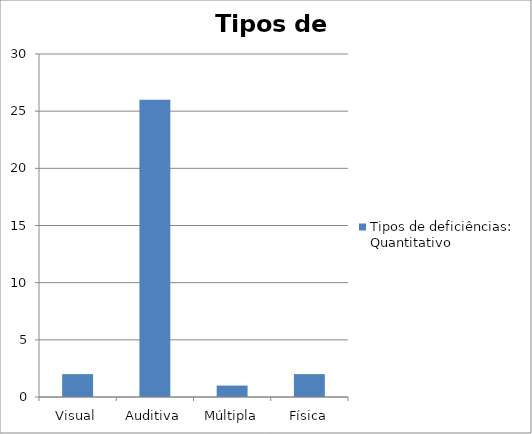
| Category | Tipos de deficiências: Quantitativo |
|---|---|
| Visual | 2 |
| Auditiva | 26 |
| Múltipla | 1 |
| Física | 2 |